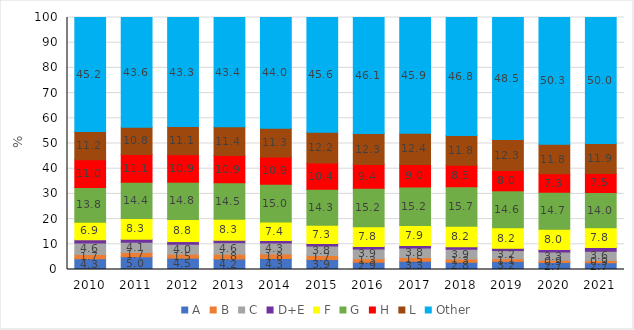
| Category | A | B | C | D+E | F | G | H | L | Other |
|---|---|---|---|---|---|---|---|---|---|
| 2010 | 4.3 | 1.65 | 4.597 | 1.295 | 6.903 | 13.764 | 11.021 | 11.233 | 45.236 |
| 2011 | 5.035 | 1.674 | 4.149 | 1.108 | 8.276 | 14.374 | 11.055 | 10.766 | 43.564 |
| 2012 | 4.518 | 1.548 | 3.956 | 1.058 | 8.781 | 14.777 | 10.932 | 11.135 | 43.295 |
| 2013 | 4.18 | 1.827 | 4.617 | 0.95 | 8.329 | 14.474 | 10.865 | 11.407 | 43.351 |
| 2014 | 4.333 | 1.848 | 4.305 | 0.98 | 7.371 | 14.953 | 10.885 | 11.334 | 43.991 |
| 2015 | 3.926 | 1.65 | 3.753 | 0.959 | 7.313 | 14.267 | 10.408 | 12.153 | 45.57 |
| 2016 | 2.923 | 1.299 | 3.934 | 1.002 | 7.818 | 15.244 | 9.415 | 12.309 | 46.058 |
| 2017 | 3.262 | 1.467 | 3.808 | 1.012 | 7.915 | 15.232 | 9.017 | 12.377 | 45.91 |
| 2018 | 2.842 | 1.283 | 3.926 | 0.953 | 8.192 | 15.659 | 8.525 | 11.825 | 46.796 |
| 2019 | 3.222 | 1.077 | 3.225 | 0.899 | 8.152 | 14.649 | 8.046 | 12.269 | 48.461 |
| 2020 | 2.735 | 0.895 | 3.328 | 1.021 | 8.022 | 14.693 | 7.26 | 11.776 | 50.27 |
| 2021 | 2.696 | 0.878 | 3.629 | 1.521 | 7.832 | 14.047 | 7.523 | 11.893 | 49.981 |